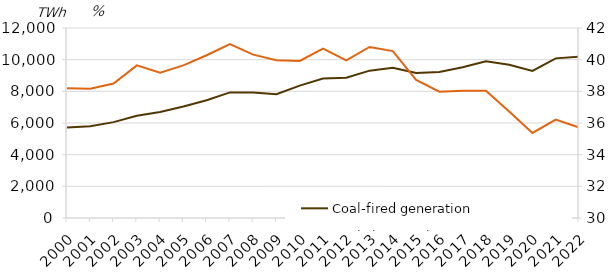
| Category | Coal-fired generation  |
|---|---|
| 2000.0 | 5719.12 |
| 2001.0 | 5801.14 |
| 2002.0 | 6056.12 |
| 2003.0 | 6458.61 |
| 2004.0 | 6697.61 |
| 2005.0 | 7040.85 |
| 2006.0 | 7439.88 |
| 2007.0 | 7931.82 |
| 2008.0 | 7927.59 |
| 2009.0 | 7817.32 |
| 2010.0 | 8358.6 |
| 2011.0 | 8814.17 |
| 2012.0 | 8855.83 |
| 2013.0 | 9306.75 |
| 2014.0 | 9495.57 |
| 2015.0 | 9160.63 |
| 2016.0 | 9226.85 |
| 2017.0 | 9518.91 |
| 2018.0 | 9899.44 |
| 2019.0 | 9680.92 |
| 2020.0 | 9292.9 |
| 2021.0 | 10081.8 |
| 2022.0 | 10190.7 |